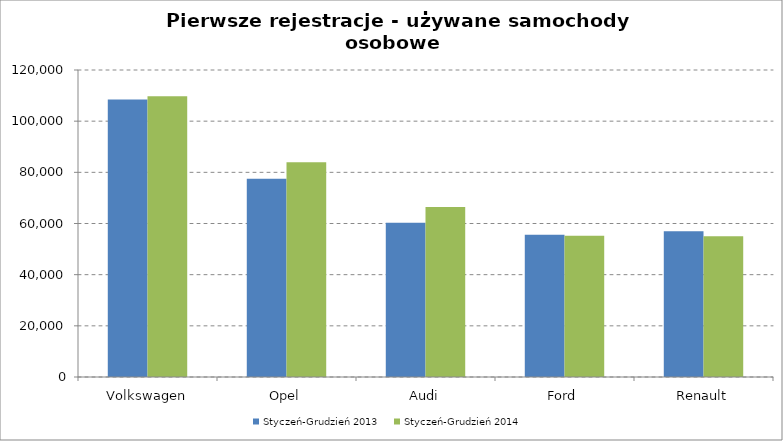
| Category | Styczeń-Grudzień 2013 | Styczeń-Grudzień 2014 |
|---|---|---|
| Volkswagen | 108436 | 109761 |
| Opel | 77447 | 83929 |
| Audi | 60338 | 66462 |
| Ford | 55578 | 55217 |
| Renault | 56956 | 55035 |